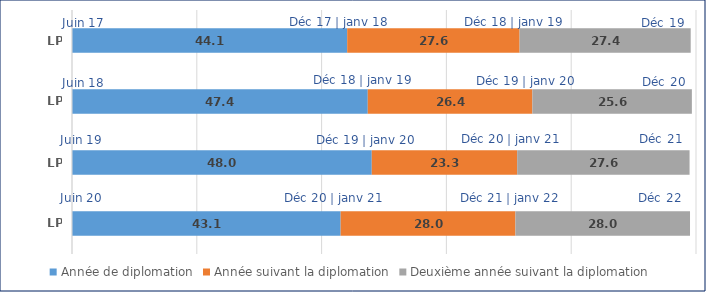
| Category | Année de diplomation | Année suivant la diplomation | Deuxième année suivant la diplomation |
|---|---|---|---|
| LP 2017 | 44.1 | 27.63 | 27.42 |
| LP 2018 | 47.4 | 26.38 | 25.56 |
| LP 2019 | 48.04 | 23.3 | 27.63 |
| LP 2020 | 43.05 | 28.01 | 27.98 |